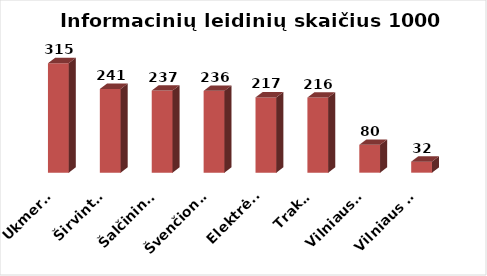
| Category | Series 0 |
|---|---|
| Ukmergė | 315.204 |
| Širvintos | 241.046 |
| Šalčininkai | 236.539 |
| Švenčionys | 235.623 |
| Elektrėnai | 216.81 |
| Trakai | 216.377 |
| Vilniaus r. | 80.266 |
| Vilniaus m. | 31.76 |